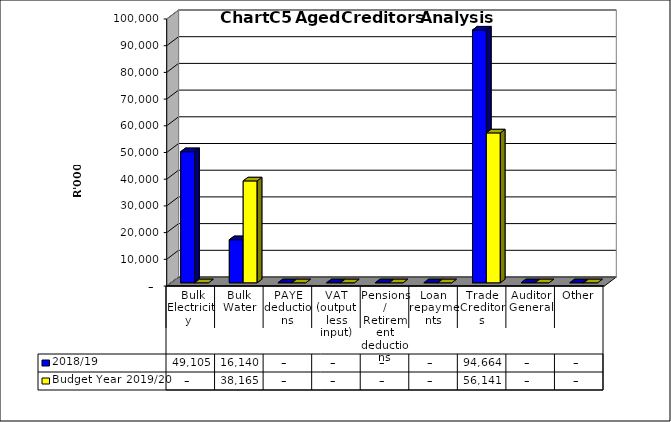
| Category | 2018/19 | Budget Year 2019/20 |
|---|---|---|
|  Bulk Electricity  | 49104722 | 0 |
| Bulk Water | 16140098 | 38164804.72 |
| PAYE deductions | 0 | 0 |
| VAT (output less input) | 0 | 0 |
| Pensions / Retirement deductions | 0 | 0 |
| Loan repayments | 0 | 0 |
| Trade Creditors | 94663528 | 56140946.22 |
| Auditor General | 0 | 0 |
| Other | 0 | 0 |